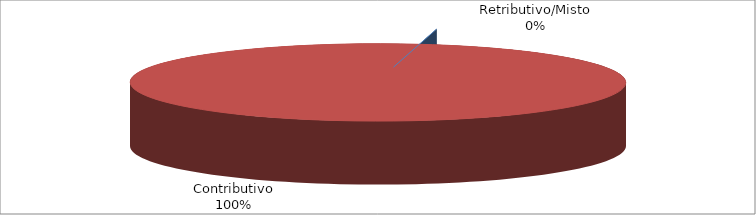
| Category | Decorrenti gennaio - settembre 2022 |
|---|---|
| Retributivo/Misto | 0 |
| Contributivo | 30350 |